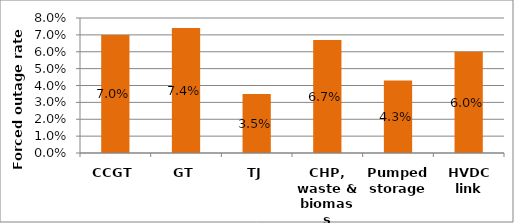
| Category | Series 0 |
|---|---|
| CCGT | 0.07 |
| GT | 0.074 |
| TJ | 0.035 |
| CHP, waste & biomass | 0.067 |
| Pumped storage | 0.043 |
| HVDC link | 0.06 |